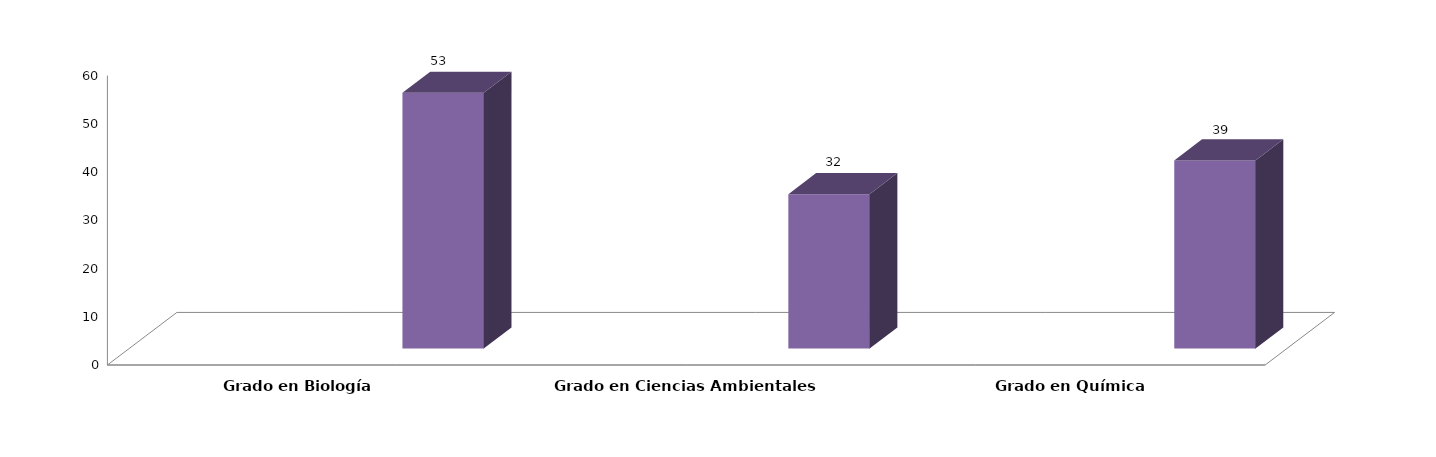
| Category | Series 0 | Series 1 | Series 2 | Series 3 |
|---|---|---|---|---|
| Grado en Biología |  |  |  | 53 |
| Grado en Ciencias Ambientales |  |  |  | 32 |
| Grado en Química |  |  |  | 39 |